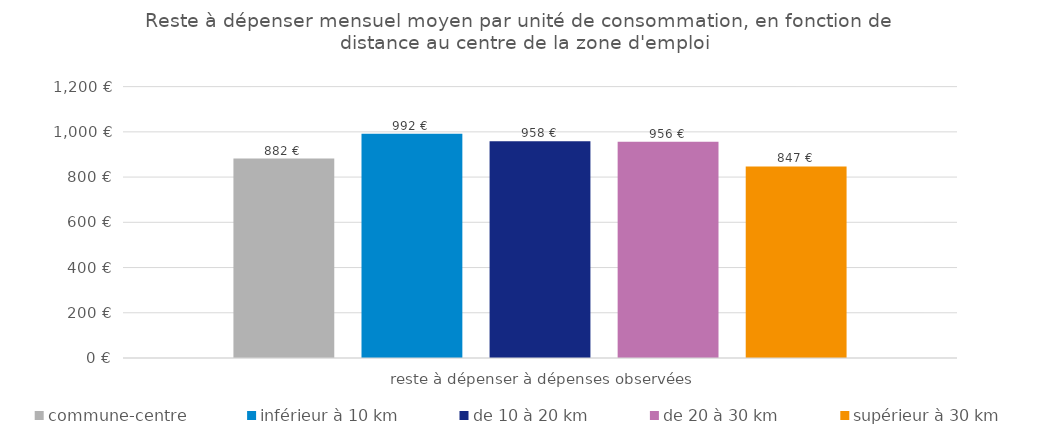
| Category | commune-centre | inférieur à 10 km | de 10 à 20 km | de 20 à 30 km | supérieur à 30 km |
|---|---|---|---|---|---|
| reste à dépenser à dépenses observées | 882 | 992 | 958 | 956 | 847 |